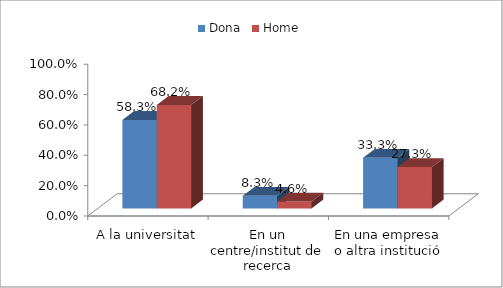
| Category | Dona | Home |
|---|---|---|
| A la universitat | 0.583 | 0.682 |
| En un centre/institut de recerca | 0.083 | 0.046 |
| En una empresa o altra institució | 0.333 | 0.273 |